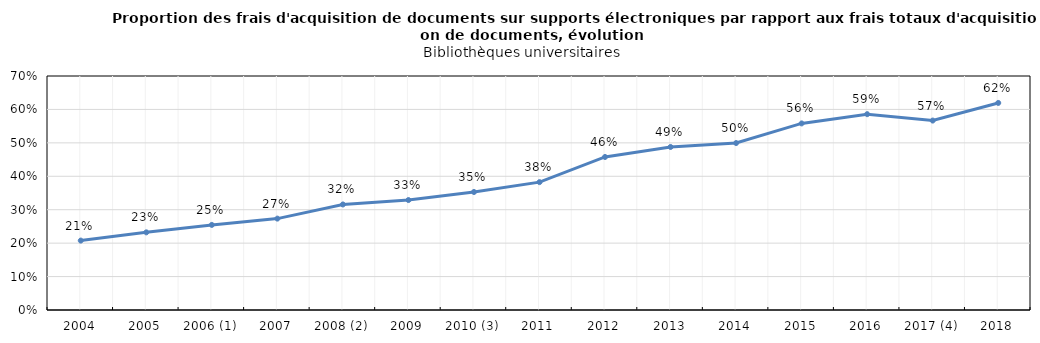
| Category | Series 0 |
|---|---|
| 2004 | 0.208 |
| 2005 | 0.232 |
| 2006 (1) | 0.255 |
| 2007 | 0.273 |
| 2008 (2) | 0.316 |
| 2009 | 0.329 |
| 2010 (3) | 0.353 |
| 2011 | 0.382 |
| 2012 | 0.458 |
| 2013 | 0.488 |
| 2014 | 0.499 |
| 2015 | 0.558 |
| 2016 | 0.586 |
| 2017 (4) | 0.567 |
| 2018 | 0.619 |